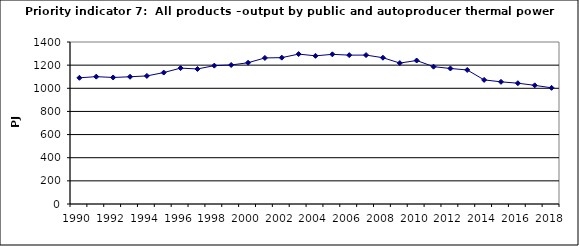
| Category | All products –output by public and autoproducer thermal power stations, PJ |
|---|---|
| 1990 | 1090.57 |
| 1991 | 1100.534 |
| 1992 | 1093.374 |
| 1993 | 1099.559 |
| 1994 | 1106.914 |
| 1995 | 1135.836 |
| 1996 | 1174.446 |
| 1997 | 1166.879 |
| 1998 | 1195.704 |
| 1999 | 1201.342 |
| 2000 | 1220.72 |
| 2001 | 1262.286 |
| 2002 | 1264.831 |
| 2003 | 1295.519 |
| 2004 | 1280.393 |
| 2005 | 1293.417 |
| 2006 | 1286.566 |
| 2007 | 1286.849 |
| 2008 | 1264.14 |
| 2009 | 1217.972 |
| 2010 | 1240.045 |
| 2011 | 1186.68 |
| 2012 | 1171.169 |
| 2013 | 1158.187 |
| 2014 | 1072.578 |
| 2015 | 1055.705 |
| 2016 | 1043.943 |
| 2017 | 1025.541 |
| 2018 | 1003.889 |